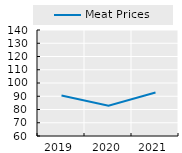
| Category | Meat Prices |
|---|---|
| 2019.0 | 90.643 |
| 2020.0 | 82.887 |
| 2021.0 | 92.784 |